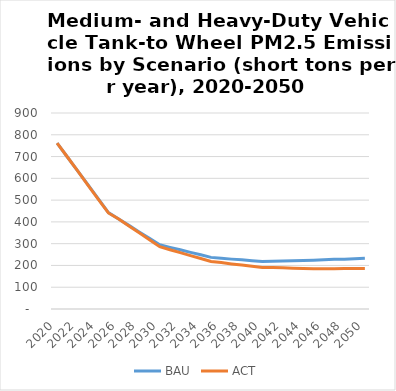
| Category | BAU | ACT |
|---|---|---|
| 2020.0 | 762 | 762 |
| 2021.0 | 698 | 698 |
| 2022.0 | 634 | 634 |
| 2023.0 | 571 | 569 |
| 2024.0 | 507 | 505 |
| 2025.0 | 443 | 441 |
| 2026.0 | 413 | 413 |
| 2027.0 | 384 | 381 |
| 2028.0 | 354 | 350 |
| 2029.0 | 325 | 318 |
| 2030.0 | 295 | 286 |
| 2031.0 | 283 | 272 |
| 2032.0 | 272 | 259 |
| 2033.0 | 260 | 245 |
| 2034.0 | 249 | 232 |
| 2035.0 | 237 | 218 |
| 2036.0 | 233 | 213 |
| 2037.0 | 229 | 207 |
| 2038.0 | 226 | 202 |
| 2039.0 | 222 | 196 |
| 2040.0 | 218 | 191 |
| 2041.0 | 219 | 190 |
| 2042.0 | 220 | 189 |
| 2043.0 | 222 | 187 |
| 2044.0 | 223 | 186 |
| 2045.0 | 224 | 185 |
| 2046.0 | 226 | 185 |
| 2047.0 | 228 | 185 |
| 2048.0 | 229 | 186 |
| 2049.0 | 231 | 186 |
| 2050.0 | 233 | 186 |